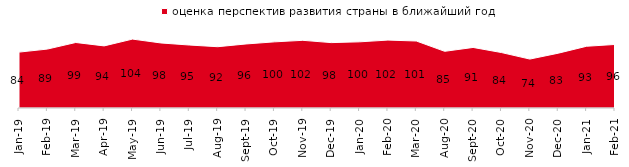
| Category | оценка перспектив развития страны в ближайший год |
|---|---|
| 2019-01-01 | 84.15 |
| 2019-02-01 | 88.75 |
| 2019-03-01 | 98.657 |
| 2019-04-01 | 93.515 |
| 2019-05-01 | 103.764 |
| 2019-06-01 | 97.955 |
| 2019-07-01 | 94.851 |
| 2019-08-01 | 92.308 |
| 2019-09-01 | 96.436 |
| 2019-10-01 | 99.604 |
| 2019-11-01 | 101.931 |
| 2019-12-01 | 98.465 |
| 2020-01-01 | 99.653 |
| 2020-02-01 | 102.277 |
| 2020-03-01 | 100.892 |
| 2020-08-01 | 85.353 |
| 2020-09-01 | 91.19 |
| 2020-10-01 | 83.508 |
| 2020-11-01 | 73.7 |
| 2020-12-01 | 82.548 |
| 2021-01-01 | 92.996 |
| 2021-02-01 | 95.682 |